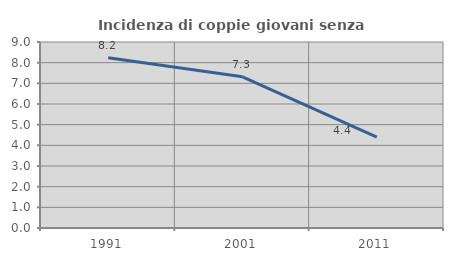
| Category | Incidenza di coppie giovani senza figli |
|---|---|
| 1991.0 | 8.243 |
| 2001.0 | 7.317 |
| 2011.0 | 4.394 |